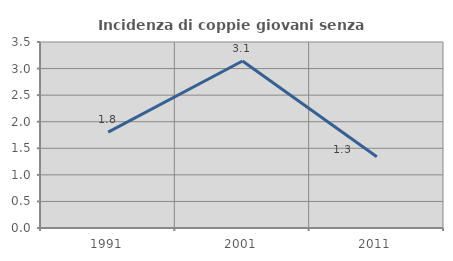
| Category | Incidenza di coppie giovani senza figli |
|---|---|
| 1991.0 | 1.804 |
| 2001.0 | 3.143 |
| 2011.0 | 1.342 |